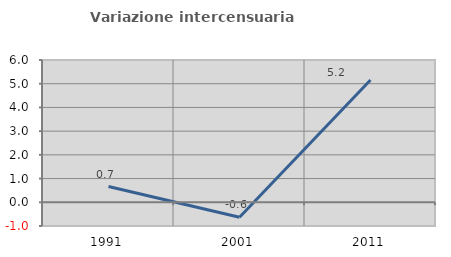
| Category | Variazione intercensuaria annua |
|---|---|
| 1991.0 | 0.664 |
| 2001.0 | -0.631 |
| 2011.0 | 5.157 |